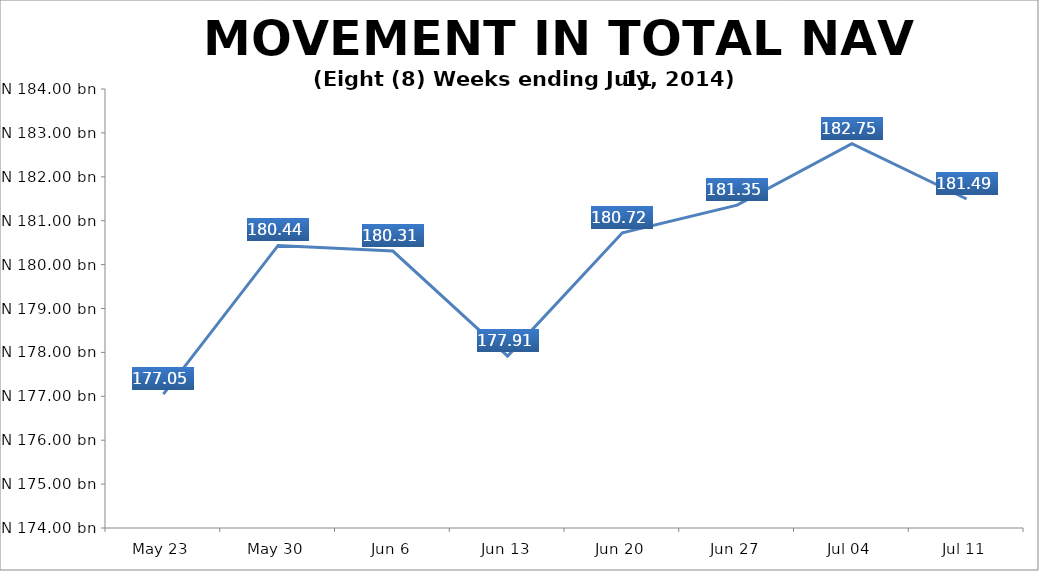
| Category | Series 0 |
|---|---|
| May 23 | 177048904557.4 |
| May 30 | 180436423196.22 |
| Jun 6 | 180308015786.93 |
| Jun 13 | 177914663703.41 |
| Jun 20 | 180724595469.96 |
| Jun 27 | 181354630907.565 |
| Jul 04 | 182752813104.33 |
| Jul 11 | 181493932879.24 |